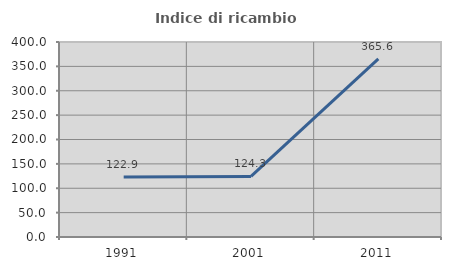
| Category | Indice di ricambio occupazionale  |
|---|---|
| 1991.0 | 122.917 |
| 2001.0 | 124.348 |
| 2011.0 | 365.574 |